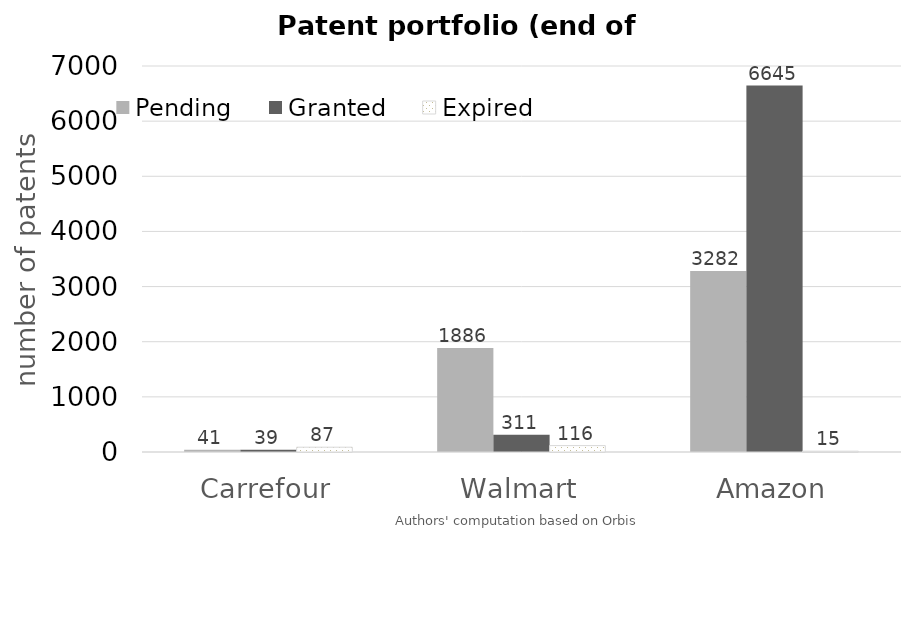
| Category | Pending | Granted | Expired |
|---|---|---|---|
| Carrefour | 41 | 39 | 87 |
| Walmart | 1886 | 311 | 116 |
| Amazon | 3282 | 6645 | 15 |